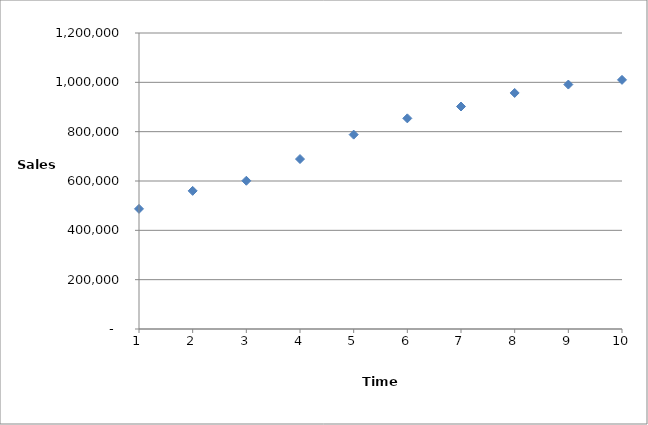
| Category | Demand |
|---|---|
| 1.0 | 487000 |
| 2.0 | 560000 |
| 3.0 | 601000 |
| 4.0 | 689000 |
| 5.0 | 788000 |
| 6.0 | 854000 |
| 7.0 | 902000 |
| 8.0 | 957000 |
| 9.0 | 991000 |
| 10.0 | 1010000 |